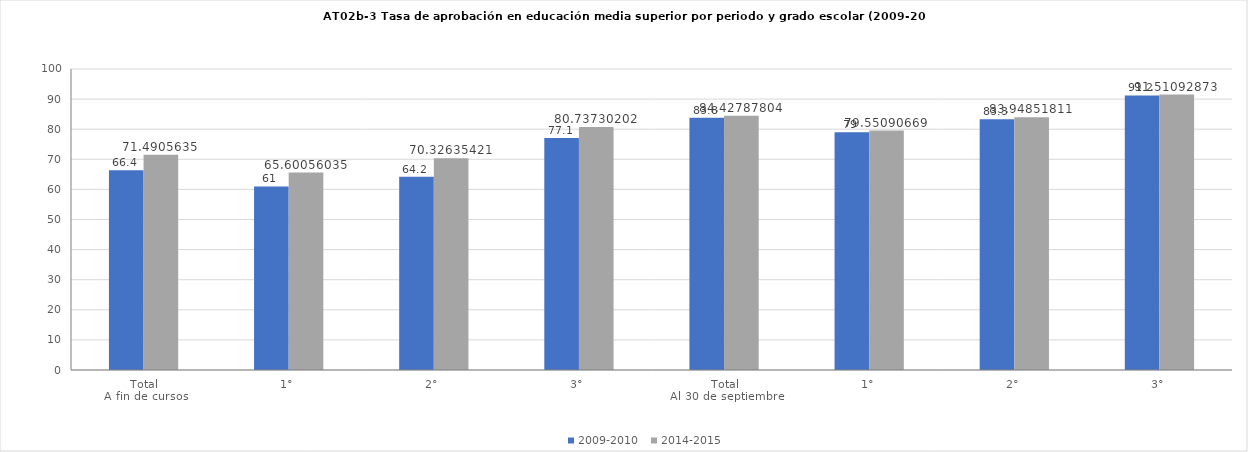
| Category | 2009-2010 | 2014-2015 |
|---|---|---|
| 0 | 66.4 | 71.491 |
| 1 | 61 | 65.601 |
| 2 | 64.2 | 70.326 |
| 3 | 77.1 | 80.737 |
| 4 | 83.8 | 84.428 |
| 5 | 79 | 79.551 |
| 6 | 83.3 | 83.949 |
| 7 | 91.2 | 91.511 |